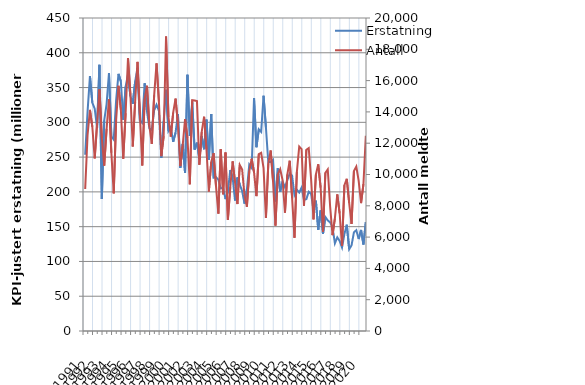
| Category | Erstatning |
|---|---|
| 1991.0 | 253.469 |
| nan | 315.36 |
| nan | 366.519 |
| nan | 328.269 |
| 1992.0 | 319.552 |
| nan | 291.981 |
| nan | 382.641 |
| nan | 189.775 |
| 1993.0 | 302.742 |
| nan | 326.193 |
| nan | 370.855 |
| nan | 280.025 |
| 1994.0 | 275.259 |
| nan | 331.438 |
| nan | 369.692 |
| nan | 358.663 |
| 1995.0 | 303.678 |
| nan | 351.299 |
| nan | 368.914 |
| nan | 337.816 |
| 1996.0 | 326.588 |
| nan | 358.519 |
| nan | 378.266 |
| nan | 302.415 |
| 1997.0 | 298.989 |
| nan | 356.113 |
| nan | 315.206 |
| nan | 291.396 |
| 1998.0 | 289.223 |
| nan | 317.273 |
| nan | 325.337 |
| nan | 316.584 |
| 1999.0 | 248.708 |
| nan | 301.782 |
| nan | 346.828 |
| nan | 287.664 |
| 2000.0 | 293.228 |
| nan | 271.936 |
| nan | 285.248 |
| nan | 311.846 |
| 2001.0 | 234.505 |
| nan | 268.968 |
| nan | 227.131 |
| nan | 368.386 |
| 2002.0 | 280.478 |
| nan | 328.826 |
| nan | 260.77 |
| nan | 270.739 |
| 2003.0 | 247.365 |
| nan | 280.296 |
| nan | 261.363 |
| nan | 303.899 |
| 2004.0 | 246.119 |
| nan | 312.001 |
| nan | 220.435 |
| nan | 221.355 |
| 2005.0 | 217.579 |
| nan | 205.064 |
| nan | 205.915 |
| nan | 189.628 |
| 2006.0 | 200.078 |
| nan | 231.376 |
| nan | 220.674 |
| nan | 187.581 |
| 2007.0 | 220.694 |
| nan | 210.821 |
| nan | 201.064 |
| nan | 183.119 |
| 2008.0 | 203.451 |
| nan | 239.218 |
| nan | 234.438 |
| nan | 334.908 |
| 2009.0 | 264.21 |
| nan | 289.974 |
| nan | 286.344 |
| nan | 338.202 |
| 2010.0 | 292.603 |
| nan | 242.276 |
| nan | 243.27 |
| nan | 246.171 |
| 2011.0 | 186.198 |
| nan | 233.898 |
| nan | 200.278 |
| nan | 214.975 |
| 2012.0 | 206.705 |
| nan | 216.668 |
| nan | 226.437 |
| nan | 223.463 |
| 2013.0 | 195.495 |
| nan | 203.199 |
| nan | 199.023 |
| nan | 206.2 |
| 2014.0 | 188.402 |
| nan | 189.607 |
| nan | 200.172 |
| nan | 197.056 |
| 2015.0 | 173.901 |
| nan | 187.368 |
| nan | 145.441 |
| nan | 173.337 |
| 2016.0 | 139.594 |
| nan | 163.833 |
| nan | 159.014 |
| nan | 156.137 |
| 2017.0 | 149.352 |
| nan | 126.055 |
| nan | 134.611 |
| nan | 129.438 |
| 2018.0 | 120.035 |
| nan | 139.312 |
| nan | 152.844 |
| nan | 117.524 |
| 2019.0 | 123.081 |
| nan | 141.817 |
| nan | 144.981 |
| nan | 132.183 |
| 2020.0 | 145.263 |
| nan | 124.327 |
| nan | 156.604 |